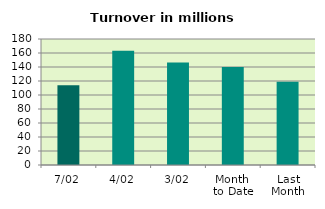
| Category | Series 0 |
|---|---|
| 7/02 | 113.963 |
| 4/02 | 163.049 |
| 3/02 | 146.323 |
| Month 
to Date | 139.825 |
| Last
Month | 119.055 |